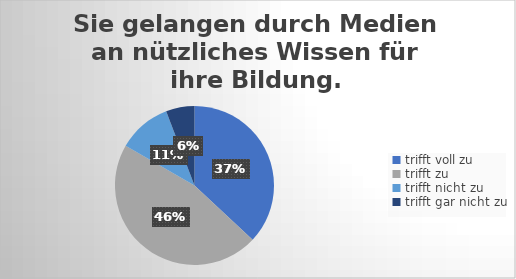
| Category | Sie gelangen durch Medien an nützliches Wissen für ihre Bildung. |
|---|---|
| trifft voll zu | 102 |
| trifft zu  | 128 |
| trifft nicht zu  | 30 |
| trifft gar nicht zu | 16 |